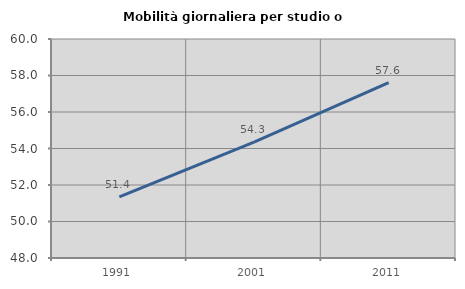
| Category | Mobilità giornaliera per studio o lavoro |
|---|---|
| 1991.0 | 51.351 |
| 2001.0 | 54.348 |
| 2011.0 | 57.616 |